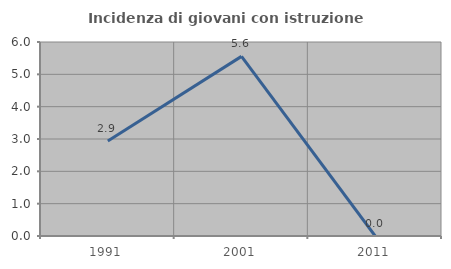
| Category | Incidenza di giovani con istruzione universitaria |
|---|---|
| 1991.0 | 2.941 |
| 2001.0 | 5.556 |
| 2011.0 | 0 |